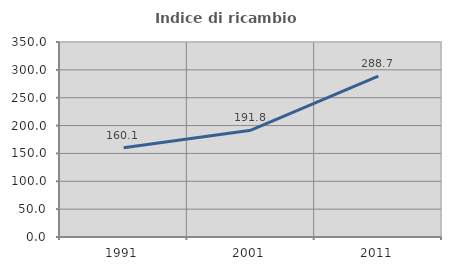
| Category | Indice di ricambio occupazionale  |
|---|---|
| 1991.0 | 160.134 |
| 2001.0 | 191.75 |
| 2011.0 | 288.674 |